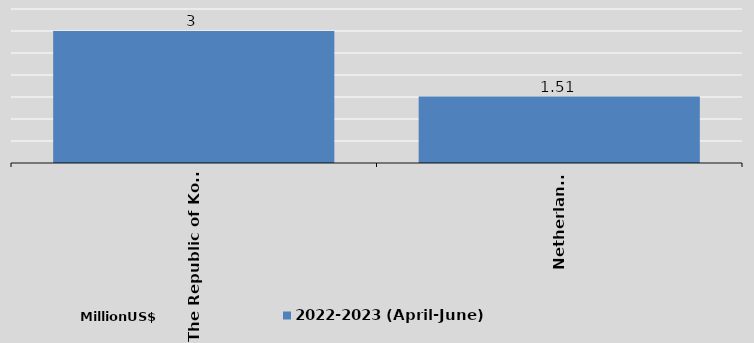
| Category | 2022-2023 (April-June)
 |
|---|---|
| The Republic of Korea | 3 |
| Netherlands | 1.51 |